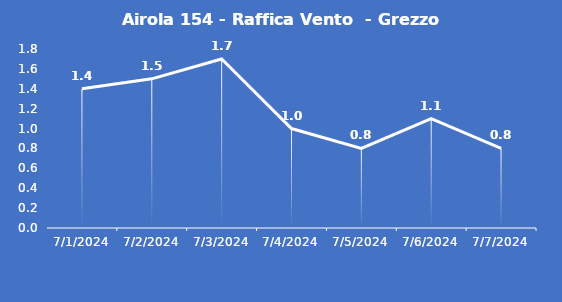
| Category | Airola 154 - Raffica Vento  - Grezzo (m/s) |
|---|---|
| 7/1/24 | 1.4 |
| 7/2/24 | 1.5 |
| 7/3/24 | 1.7 |
| 7/4/24 | 1 |
| 7/5/24 | 0.8 |
| 7/6/24 | 1.1 |
| 7/7/24 | 0.8 |